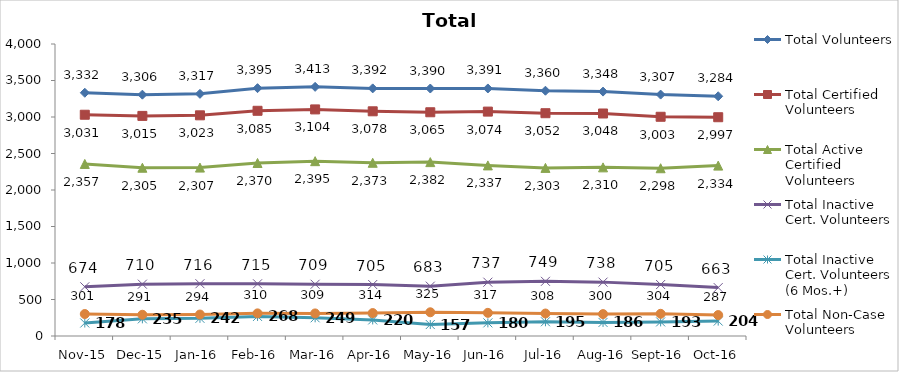
| Category | Total Volunteers | Total Certified Volunteers | Total Active Certified Volunteers | Total Inactive Cert. Volunteers | Total Inactive Cert. Volunteers (6 Mos.+) | Total Non-Case Volunteers |
|---|---|---|---|---|---|---|
| Nov-15 | 3332 | 3031 | 2357 | 674 | 178 | 301 |
| Dec-15 | 3306 | 3015 | 2305 | 710 | 235 | 291 |
| Jan-16 | 3317 | 3023 | 2307 | 716 | 242 | 294 |
| Feb-16 | 3395 | 3085 | 2370 | 715 | 268 | 310 |
| Mar-16 | 3413 | 3104 | 2395 | 709 | 249 | 309 |
| Apr-16 | 3392 | 3078 | 2373 | 705 | 220 | 314 |
| May-16 | 3390 | 3065 | 2382 | 683 | 157 | 325 |
| Jun-16 | 3391 | 3074 | 2337 | 737 | 180 | 317 |
| Jul-16 | 3360 | 3052 | 2303 | 749 | 195 | 308 |
| Aug-16 | 3348 | 3048 | 2310 | 738 | 186 | 300 |
| Sep-16 | 3307 | 3003 | 2298 | 705 | 193 | 304 |
| Oct-16 | 3284 | 2997 | 2334 | 663 | 204 | 287 |